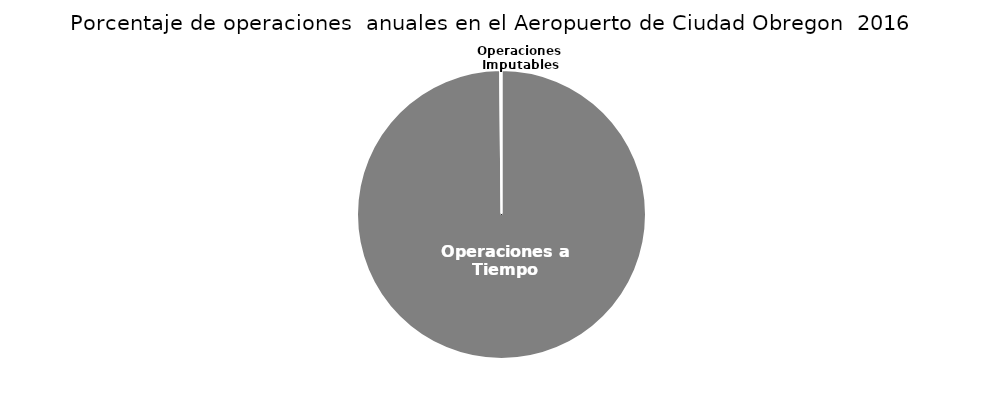
| Category | Series 0 |
|---|---|
| Operaciones a Tiempo | 2668 |
| Operaciones Imputables | 4 |